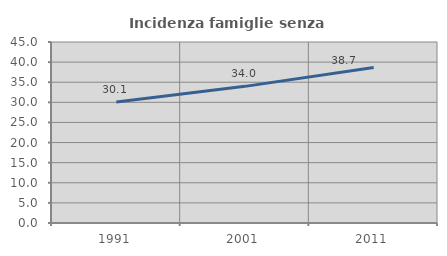
| Category | Incidenza famiglie senza nuclei |
|---|---|
| 1991.0 | 30.081 |
| 2001.0 | 33.971 |
| 2011.0 | 38.661 |